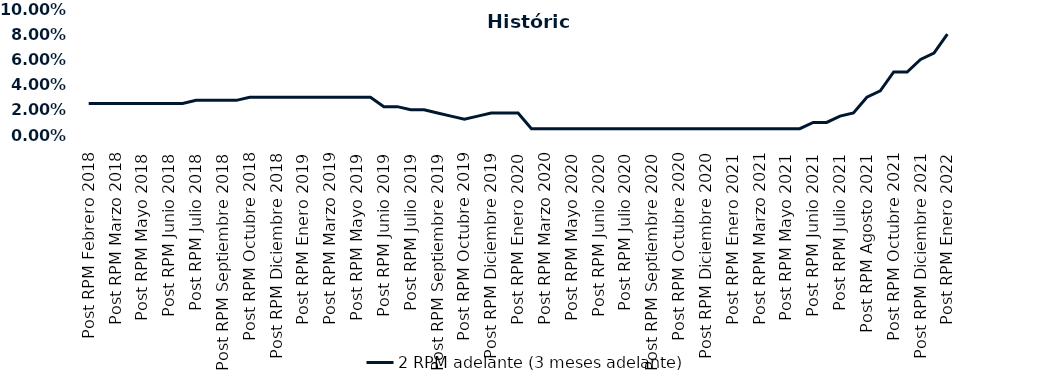
| Category | 2 RPM adelante (3 meses adelante) |
|---|---|
| Post RPM Febrero 2018 | 0.025 |
| Pre RPM Marzo 2018 | 0.025 |
| Post RPM Marzo 2018 | 0.025 |
| Pre RPM Mayo 2018 | 0.025 |
| Post RPM Mayo 2018 | 0.025 |
| Pre RPM Junio 2018 | 0.025 |
| Post RPM Junio 2018 | 0.025 |
| Pre RPM Julio 2018 | 0.025 |
| Post RPM Julio 2018 | 0.028 |
| Pre RPM Septiembre 2018 | 0.028 |
| Post RPM Septiembre 2018 | 0.028 |
| Pre RPM Octubre 2018 | 0.028 |
| Post RPM Octubre 2018 | 0.03 |
| Pre RPM Diciembre 2018 | 0.03 |
| Post RPM Diciembre 2018 | 0.03 |
| Pre RPM Enero 2019 | 0.03 |
| Post RPM Enero 2019 | 0.03 |
| Pre RPM Marzo 2019 | 0.03 |
| Post RPM Marzo 2019 | 0.03 |
| Pre RPM Mayo 2019 | 0.03 |
| Post RPM Mayo 2019 | 0.03 |
| Pre RPM Junio 2019 | 0.03 |
| Post RPM Junio 2019 | 0.022 |
| Pre RPM Julio 2019 | 0.022 |
| Post RPM Julio 2019 | 0.02 |
| Pre RPM Septiembre 2019 | 0.02 |
| Post RPM Septiembre 2019 | 0.018 |
| Pre RPM Octubre 2019 | 0.015 |
| Post RPM Octubre 2019 | 0.012 |
| Pre RPM Diciembre 2019 | 0.015 |
| Post RPM Diciembre 2019 | 0.018 |
| Pre RPM Enero 2020 | 0.018 |
| Post RPM Enero 2020 | 0.018 |
| Pre RPM Marzo 2020 | 0.005 |
| Post RPM Marzo 2020 | 0.005 |
| Pre RPM Mayo 2020 | 0.005 |
| Post RPM Mayo 2020 | 0.005 |
| Pre RPM Junio 2020 | 0.005 |
| Post RPM Junio 2020 | 0.005 |
| Pre RPM Julio 2020 | 0.005 |
| Post RPM Julio 2020 | 0.005 |
| Pre RPM Septiembre 2020 | 0.005 |
| Post RPM Septiembre 2020 | 0.005 |
| Pre RPM Octubre 2020 | 0.005 |
| Post RPM Octubre 2020 | 0.005 |
| Pre RPM Diciembre 2020 | 0.005 |
| Post RPM Diciembre 2020 | 0.005 |
| Pre RPM Enero 2021 | 0.005 |
| Post RPM Enero 2021 | 0.005 |
| Pre RPM Marzo 2021 | 0.005 |
| Post RPM Marzo 2021 | 0.005 |
| Pre RPM Mayo 2021 | 0.005 |
| Post RPM Mayo 2021 | 0.005 |
| Pre RPM Junio 2021 | 0.005 |
| Post RPM Junio 2021 | 0.01 |
| Pre RPM Julio 2021 | 0.01 |
| Post RPM Julio 2021 | 0.015 |
| Pre RPM Agosto 2021 | 0.018 |
| Post RPM Agosto 2021 | 0.03 |
| Pre RPM Octubre 2021 | 0.035 |
| Post RPM Octubre 2021 | 0.05 |
| Pre RPM Diciembre 2021 | 0.05 |
| Post RPM Diciembre 2021 | 0.06 |
| Pre RPM Enero 2022 | 0.065 |
| Post RPM Enero 2022 | 0.08 |